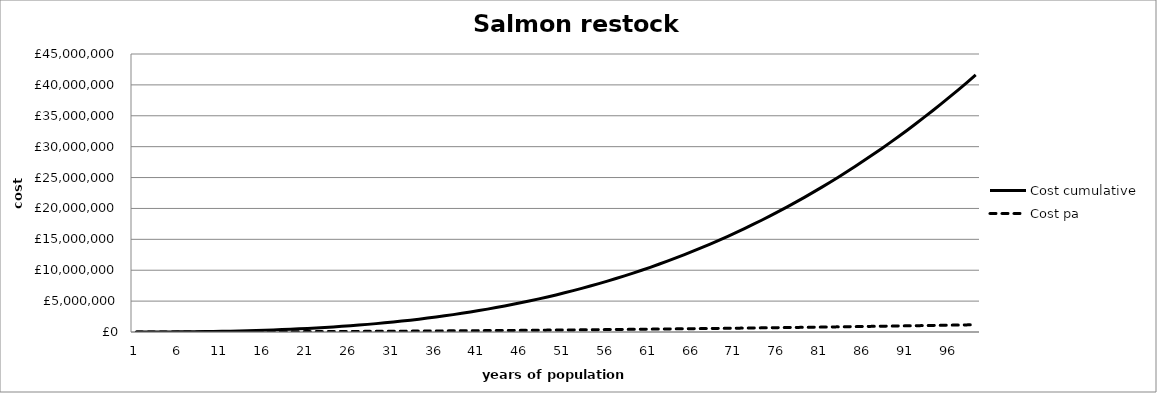
| Category | Cost pa | Cost cumulative |
|---|---|---|
| 0 | 0 | 0 |
| 1 | 1018.612 | 1018.612 |
| 2 | 2263.581 | 3282.193 |
| 3 | 3734.909 | 7017.103 |
| 4 | 5432.596 | 12449.698 |
| 5 | 7356.64 | 19806.338 |
| 6 | 9507.042 | 29313.38 |
| 7 | 11883.803 | 41197.183 |
| 8 | 14486.922 | 55684.105 |
| 9 | 17316.398 | 73000.503 |
| 10 | 20372.233 | 93372.736 |
| 11 | 23654.427 | 117027.163 |
| 12 | 27162.978 | 144190.141 |
| 13 | 30897.887 | 175088.028 |
| 14 | 34859.155 | 209947.183 |
| 15 | 39046.781 | 248993.964 |
| 16 | 43460.765 | 292454.728 |
| 17 | 48101.107 | 340555.835 |
| 18 | 52967.807 | 393523.642 |
| 19 | 58060.865 | 451584.507 |
| 20 | 63380.282 | 514964.789 |
| 21 | 68926.056 | 583890.845 |
| 22 | 74698.189 | 658589.034 |
| 23 | 80696.68 | 739285.714 |
| 24 | 86921.529 | 826207.243 |
| 25 | 93372.736 | 919579.98 |
| 26 | 100050.302 | 1019630.282 |
| 27 | 106954.225 | 1126584.507 |
| 28 | 114084.507 | 1240669.014 |
| 29 | 121441.147 | 1362110.161 |
| 30 | 129024.145 | 1491134.306 |
| 31 | 136833.501 | 1627967.807 |
| 32 | 144869.215 | 1772837.022 |
| 33 | 153131.288 | 1925968.31 |
| 34 | 161619.718 | 2087588.028 |
| 35 | 170334.507 | 2257922.535 |
| 36 | 179275.654 | 2437198.189 |
| 37 | 188443.159 | 2625641.348 |
| 38 | 197837.022 | 2823478.37 |
| 39 | 207457.243 | 3030935.614 |
| 40 | 217303.823 | 3248239.437 |
| 41 | 227376.761 | 3475616.197 |
| 42 | 237676.056 | 3713292.254 |
| 43 | 248201.71 | 3961493.964 |
| 44 | 258953.722 | 4220447.686 |
| 45 | 269932.093 | 4490379.779 |
| 46 | 281136.821 | 4771516.6 |
| 47 | 292567.907 | 5064084.507 |
| 48 | 304225.352 | 5368309.859 |
| 49 | 316109.155 | 5684419.014 |
| 50 | 328219.316 | 6012638.33 |
| 51 | 340555.835 | 6353194.165 |
| 52 | 353118.712 | 6706312.877 |
| 53 | 365907.948 | 7072220.825 |
| 54 | 378923.541 | 7451144.366 |
| 55 | 392165.493 | 7843309.859 |
| 56 | 405633.803 | 8248943.662 |
| 57 | 419328.471 | 8668272.133 |
| 58 | 433249.497 | 9101521.63 |
| 59 | 447396.881 | 9548918.511 |
| 60 | 461770.624 | 10010689.135 |
| 61 | 476370.724 | 10487059.859 |
| 62 | 491197.183 | 10978257.042 |
| 63 | 506250 | 11484507.042 |
| 64 | 521529.175 | 12006036.217 |
| 65 | 537034.708 | 12543070.926 |
| 66 | 552766.6 | 13095837.525 |
| 67 | 568724.849 | 13664562.374 |
| 68 | 584909.457 | 14249471.831 |
| 69 | 601320.423 | 14850792.254 |
| 70 | 617957.746 | 15468750 |
| 71 | 634821.429 | 16103571.429 |
| 72 | 651911.469 | 16755482.897 |
| 73 | 669227.867 | 17424710.765 |
| 74 | 686770.624 | 18111481.388 |
| 75 | 704539.738 | 18816021.127 |
| 76 | 722535.211 | 19538556.338 |
| 77 | 740757.042 | 20279313.38 |
| 78 | 759205.231 | 21038518.612 |
| 79 | 777879.779 | 21816398.39 |
| 80 | 796780.684 | 22613179.074 |
| 81 | 815907.948 | 23429087.022 |
| 82 | 835261.569 | 24264348.592 |
| 83 | 854841.549 | 25119190.141 |
| 84 | 874647.887 | 25993838.028 |
| 85 | 894680.584 | 26888518.612 |
| 86 | 914939.638 | 27803458.249 |
| 87 | 935425.05 | 28738883.3 |
| 88 | 956136.821 | 29695020.121 |
| 89 | 977074.95 | 30672095.07 |
| 90 | 998239.437 | 31670334.507 |
| 91 | 1019630.282 | 32689964.789 |
| 92 | 1041247.485 | 33731212.274 |
| 93 | 1063091.046 | 34794303.32 |
| 94 | 1085160.966 | 35879464.286 |
| 95 | 1107457.243 | 36986921.529 |
| 96 | 1129979.879 | 38116901.408 |
| 97 | 1152728.873 | 39269630.282 |
| 98 | 1175704.225 | 40445334.507 |